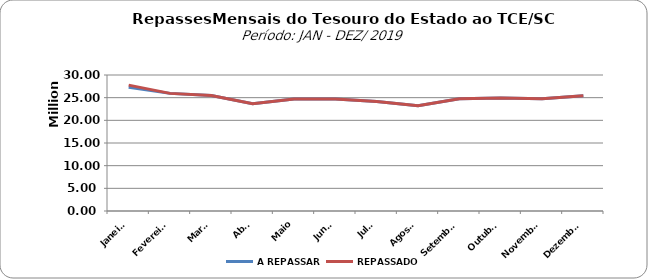
| Category | A REPASSAR | REPASSADO |
|---|---|---|
| Janeiro | 27320568.28 | 27770744.46 |
| Fevereiro | 25946442.12 | 25946442.12 |
| Março | 25468251.93 | 25468251.93 |
| Abril | 23667980.41 | 23667980.41 |
| Maio | 24690586.67 | 24690586.67 |
| Junho | 24732773.84 | 24732773.84 |
| Julho | 24159018.42 | 24159018.42 |
| Agosto | 23217829.45 | 23217829.45 |
| Setembro | 24771324.16 | 24771324.16 |
| Outubro | 24937540.78 | 24938540.77 |
| Novembro | 24767392 | 24767392 |
| Dezembro | 25441730.02 | 25441730.02 |